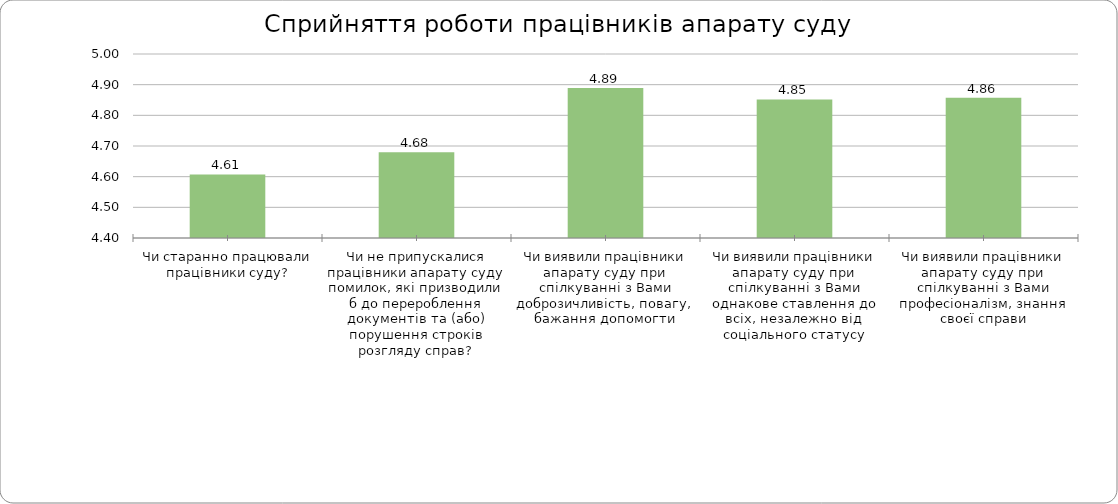
| Category | Series 0 |
|---|---|
| Чи старанно працювали працівники суду? | 4.607 |
| Чи не припускалися працівники апарату суду помилок, які призводили б до перероблення документів та (або) порушення строків розгляду справ? | 4.68 |
| Чи виявили працівники апарату суду при спілкуванні з Вами доброзичливість, повагу, бажання допомогти | 4.889 |
| Чи виявили працівники апарату суду при спілкуванні з Вами однакове ставлення до всіх, незалежно від соціального статусу | 4.852 |
| Чи виявили працівники апарату суду при спілкуванні з Вами професіоналізм, знання своєї справи | 4.857 |